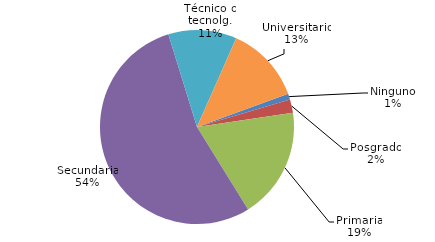
| Category | -46,2 |
|---|---|
| Ninguno | 12.811 |
| Posgrado | 30.035 |
| Primaria | 245.722 |
| Secundaria | 718.128 |
| Técnico o tecnolg. | 151.278 |
| Universitario | 170.387 |